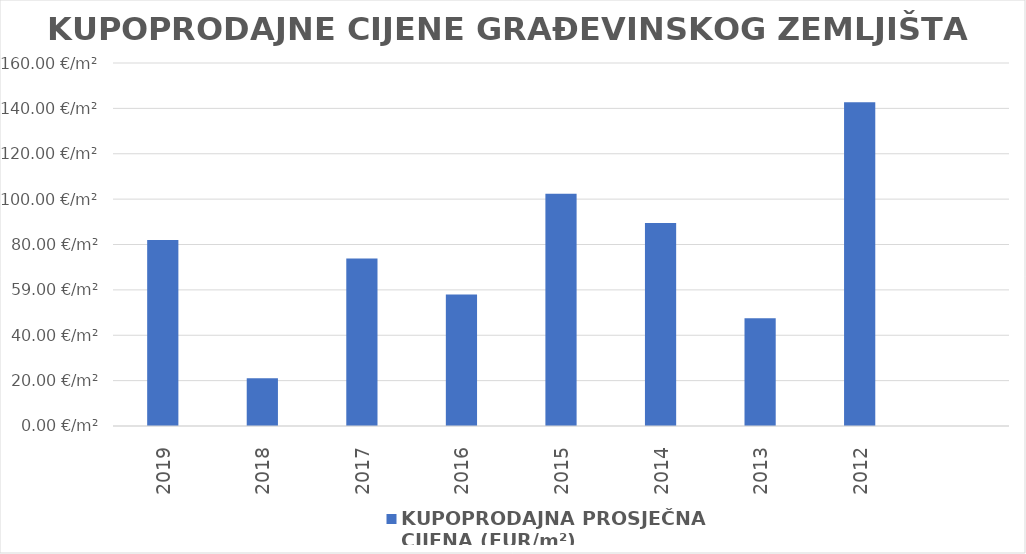
| Category | KUPOPRODAJNA PROSJEČNA 
CIJENA (EUR/m²) |
|---|---|
| 2019 | 1900-03-21 23:42:35 |
| 2018 | 1900-01-21 02:26:10 |
| 2017 | 1900-03-13 20:53:14 |
| 2016 | 1900-02-27 00:14:38 |
| 2015 | 1900-04-11 08:00:09 |
| 2014 | 1900-03-29 11:22:24 |
| 2013 | 1900-02-16 10:53:54 |
| 2012 | 1900-05-21 17:40:30 |